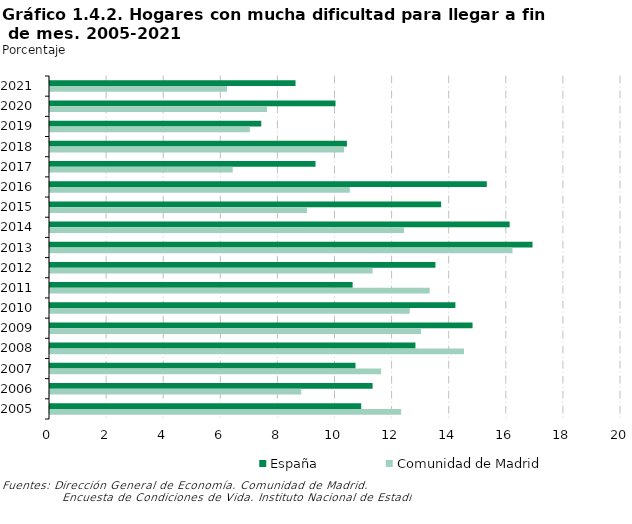
| Category | España | Comunidad de Madrid |
|---|---|---|
| 2021 | 8.6 | 6.2 |
| 2020 | 10 | 7.6 |
| 2019 | 7.4 | 7 |
| 2018 | 10.4 | 10.3 |
| 2017 | 9.3 | 6.4 |
| 2016 | 15.3 | 10.5 |
| 2015 | 13.7 | 9 |
| 2014 | 16.1 | 12.4 |
| 2013 | 16.9 | 16.2 |
| 2012 | 13.5 | 11.3 |
| 2011 | 10.6 | 13.3 |
| 2010 | 14.2 | 12.6 |
| 2009 | 14.8 | 13 |
| 2008 | 12.8 | 14.5 |
| 2007 | 10.7 | 11.6 |
| 2006 | 11.3 | 8.8 |
| 2005 | 10.9 | 12.3 |